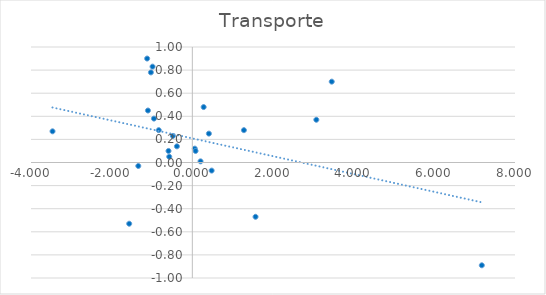
| Category | Transporte |
|---|---|
| 0.06052582200249956 | 0.12 |
| -1.339539147515001 | -0.03 |
| -1.1203229332582998 | 0.9 |
| -0.9862037445886013 | 0.83 |
| -3.4662710747771994 | 0.27 |
| 0.4103518494638997 | 0.25 |
| -1.5653149541481977 | -0.53 |
| 1.5673496706761991 | -0.47 |
| 7.1770364527009995 | -0.89 |
| 0.47884246635880034 | -0.07 |
| -0.832734952533401 | 0.28 |
| 3.4562493478376117 | 0.7 |
| 0.28079979651694786 | 0.48 |
| -0.5906758229193689 | 0.1 |
| -0.38208630553888956 | 0.14 |
| -0.5726169698249004 | 0.05 |
| 0.08025158798270066 | 0.1 |
| 1.2789830493301095 | 0.28 |
| -1.1005497828799102 | 0.45 |
| 0.20330044603610042 | 0.01 |
| -0.48222478231940147 | 0.23 |
| -0.9518304220709997 | 0.38 |
| -1.027059621055 | 0.78 |
| 3.074367518631871 | 0.37 |